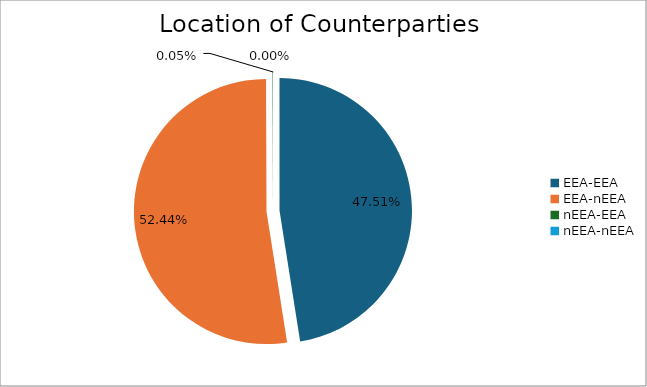
| Category | Series 0 |
|---|---|
| EEA-EEA | 6872930.794 |
| EEA-nEEA | 7586218.292 |
| nEEA-EEA | 7851.079 |
| nEEA-nEEA | 196.801 |